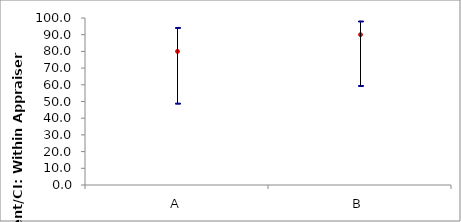
| Category | Percent | 95.0% LC (Score) | 95.0% UC (Score) |
|---|---|---|---|
| A | 80 | 49.016 | 94.332 |
| B | 90 | 59.585 | 98.212 |